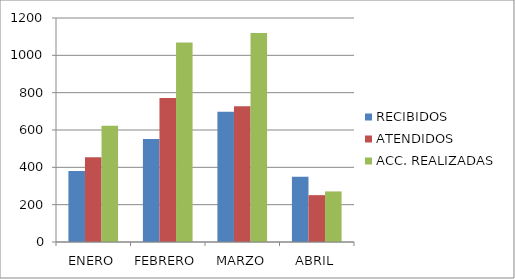
| Category | RECIBIDOS | ATENDIDOS | ACC. REALIZADAS |
|---|---|---|---|
| ENERO | 380 | 454 | 623 |
| FEBRERO | 552 | 772 | 1069 |
| MARZO | 698 | 727 | 1119 |
| ABRIL | 350 | 251 | 271 |